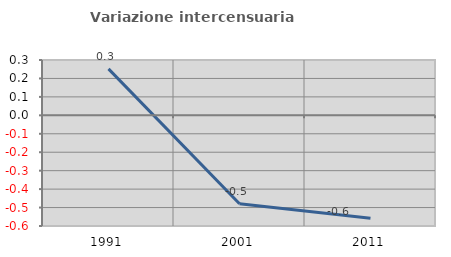
| Category | Variazione intercensuaria annua |
|---|---|
| 1991.0 | 0.252 |
| 2001.0 | -0.479 |
| 2011.0 | -0.558 |